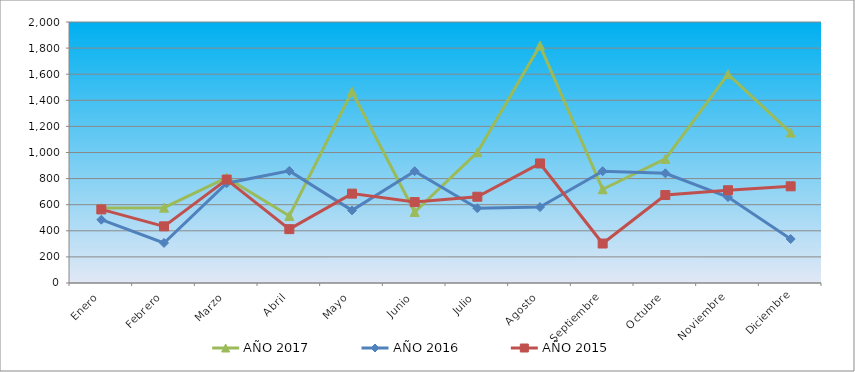
| Category | AÑO 2017 | AÑO 2016 | AÑO 2015 |
|---|---|---|---|
| Enero | 575.013 | 485.147 | 563.845 |
| Febrero | 577.568 | 306.752 | 434.225 |
| Marzo | 807.573 | 764.384 | 792.839 |
| Abril | 513.678 | 859.066 | 412.622 |
| Mayo | 1466.921 | 556.545 | 684.823 |
| Junio | 544.345 | 856.757 | 620.013 |
| Julio | 1001.8 | 572.711 | 661.059 |
| Agosto | 1819.596 | 581.948 | 915.978 |
| Septiembre | 718.127 | 856.757 | 302.445 |
| Octubre | 950.688 | 840.591 | 674.021 |
| Noviembre | 1599.813 | 658.155 | 710.747 |
| Diciembre | 1152.581 | 337.16 | 740.991 |